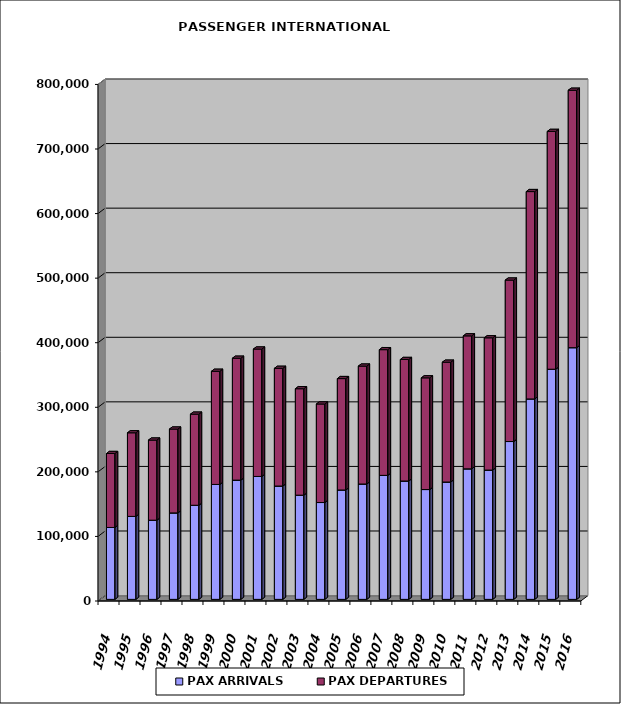
| Category | PAX ARRIVALS | PAX DEPARTURES |
|---|---|---|
| 1994.0 | 111329 | 114567 |
| 1995.0 | 128498 | 129480 |
| 1996.0 | 122653 | 124027 |
| 1997.0 | 133883 | 129852 |
| 1998.0 | 145740 | 141069 |
| 1999.0 | 177997 | 175196 |
| 2000.0 | 184681 | 188747 |
| 2001.0 | 190361 | 197298 |
| 2002.0 | 175531 | 182266 |
| 2003.0 | 161390 | 164842 |
| 2004.0 | 149988 | 152576 |
| 2005.0 | 169419 | 172494 |
| 2006.0 | 178691 | 182571 |
| 2007.0 | 192042 | 194682 |
| 2008.0 | 183339 | 188145 |
| 2009.0 | 170090 | 172978 |
| 2010.0 | 181746 | 185537 |
| 2011.0 | 202139 | 205935 |
| 2012.0 | 200271 | 204800 |
| 2013.0 | 244449 | 250017 |
| 2014.0 | 310416 | 321118 |
| 2015.0 | 356443 | 368254 |
| 2016.0 | 389817 | 398647 |